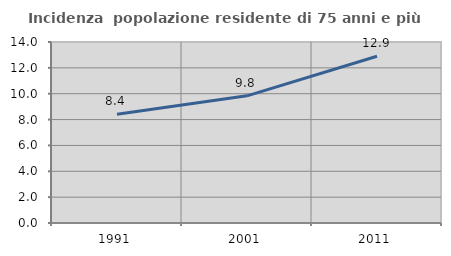
| Category | Incidenza  popolazione residente di 75 anni e più |
|---|---|
| 1991.0 | 8.407 |
| 2001.0 | 9.837 |
| 2011.0 | 12.901 |